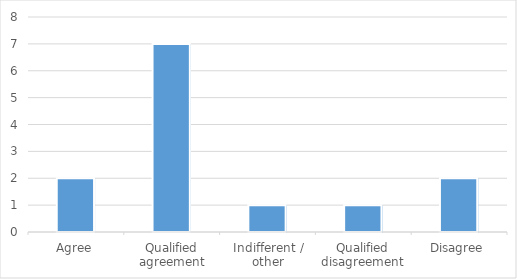
| Category | Series 0 |
|---|---|
| Agree | 2 |
| Qualified agreement | 7 |
| Indifferent / other | 1 |
| Qualified disagreement | 1 |
| Disagree | 2 |